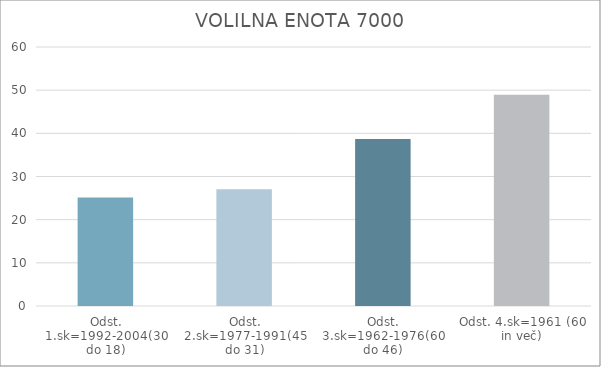
| Category | Series 0 |
|---|---|
| Odst. 1.sk=1992-2004(30 do 18) | 25.16 |
| Odst. 2.sk=1977-1991(45 do 31) | 27.06 |
| Odst. 3.sk=1962-1976(60 do 46) | 38.69 |
| Odst. 4.sk=1961 (60 in več) | 48.91 |